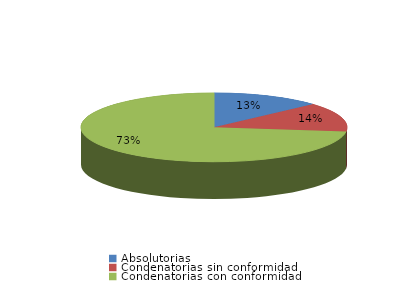
| Category | Series 0 |
|---|---|
| Absolutorias | 33 |
| Condenatorias sin conformidad | 34 |
| Condenatorias con conformidad | 182 |